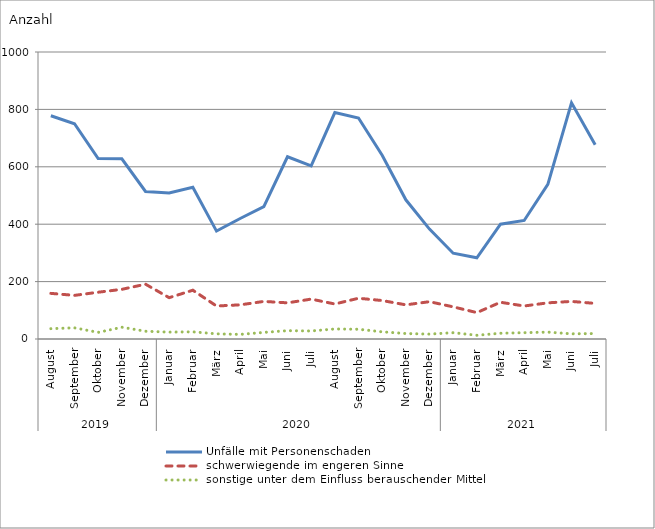
| Category | Unfälle mit Personenschaden | schwerwiegende im engeren Sinne | sonstige unter dem Einfluss berauschender Mittel |
|---|---|---|---|
| 0 | 778 | 159 | 36 |
| 1 | 750 | 152 | 39 |
| 2 | 629 | 163 | 23 |
| 3 | 628 | 173 | 41 |
| 4 | 514 | 191 | 27 |
| 5 | 509 | 144 | 24 |
| 6 | 529 | 170 | 25 |
| 7 | 376 | 115 | 18 |
| 8 | 420 | 119 | 16 |
| 9 | 461 | 131 | 23 |
| 10 | 635 | 126 | 29 |
| 11 | 603 | 139 | 28 |
| 12 | 789 | 122 | 35 |
| 13 | 770 | 142 | 34 |
| 14 | 640 | 134 | 25 |
| 15 | 485 | 119 | 19 |
| 16 | 383 | 130 | 17 |
| 17 | 299 | 112 | 22 |
| 18 | 283 | 92 | 13 |
| 19 | 400 | 128 | 20 |
| 20 | 413 | 115 | 22 |
| 21 | 539 | 126 | 24 |
| 22 | 823 | 131 | 18 |
| 23 | 677 | 124 | 19 |